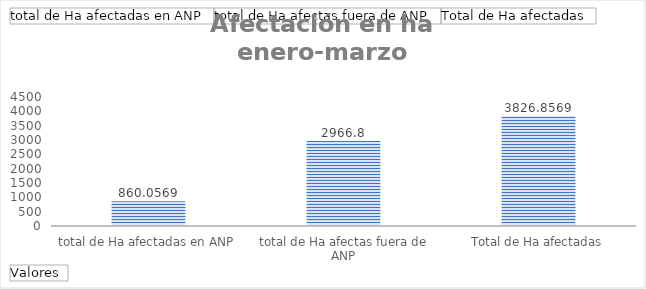
| Category | Total |
|---|---|
| total de Ha afectadas en ANP | 860.057 |
| total de Ha afectas fuera de ANP | 2966.8 |
| Total de Ha afectadas | 3826.857 |